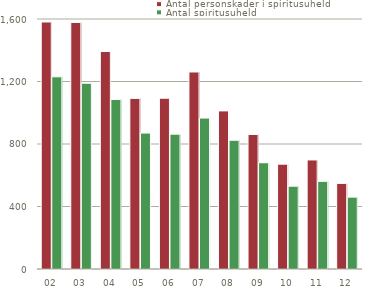
| Category | Antal personskader i spiritusuheld | Antal spiritusuheld |
|---|---|---|
| 02 | 1581 | 1230 |
| 03 | 1578 | 1189 |
| 04 | 1392 | 1085 |
| 05 | 1092 | 870 |
| 06 | 1093 | 863 |
| 07 | 1261 | 966 |
| 08 | 1012 | 824 |
| 09 | 861 | 680 |
| 10 | 671 | 530 |
| 11 | 698 | 561 |
| 12 | 548 | 460 |